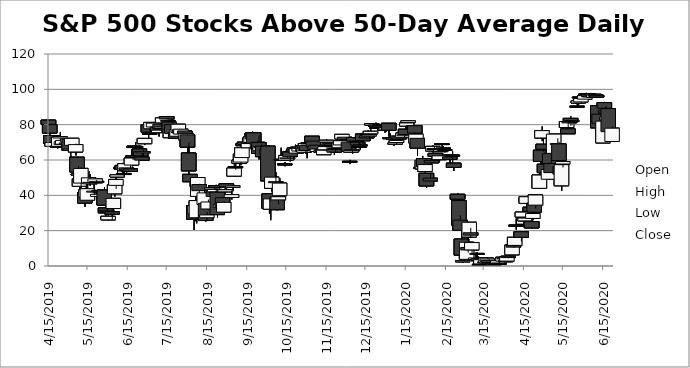
| Category | Open | High | Low | Close |
|---|---|---|---|---|
| 4/15/19 | 82.57 | 82.57 | 79.4 | 80.19 |
| 4/16/19 | 80 | 80 | 74.25 | 75.24 |
| 4/17/19 | 73.86 | 73.86 | 68.51 | 69.3 |
| 4/18/19 | 67.72 | 71.28 | 67.72 | 69.9 |
| 4/22/19 | 67.92 | 69.3 | 66.53 | 67.32 |
| 4/23/19 | 67.72 | 74.05 | 67.72 | 73.06 |
| 4/24/19 | 72.47 | 75.64 | 70.69 | 73.26 |
| 4/25/19 | 68.71 | 71.68 | 67.32 | 70.29 |
| 4/26/19 | 68.91 | 71.08 | 67.72 | 71.08 |
| 4/29/19 | 69.1 | 70.89 | 68.51 | 69.7 |
| 4/30/19 | 70.29 | 72.07 | 66.73 | 72.07 |
| 5/1/19 | 71.88 | 71.88 | 65.54 | 65.54 |
| 5/2/19 | 65.54 | 68.11 | 61.58 | 66.13 |
| 5/3/19 | 68.31 | 72.27 | 68.11 | 72.27 |
| 5/6/19 | 64.55 | 69.3 | 62.57 | 68.71 |
| 5/7/19 | 61.58 | 61.78 | 50.09 | 53.26 |
| 5/8/19 | 51.48 | 56.63 | 51.48 | 52.07 |
| 5/9/19 | 45.14 | 51.08 | 40.39 | 49.3 |
| 5/10/19 | 46.93 | 56.03 | 38.81 | 55.24 |
| 5/13/19 | 41.58 | 41.58 | 33.46 | 35.64 |
| 5/14/19 | 39 | 46.73 | 39 | 43.16 |
| 5/15/19 | 37.22 | 46.53 | 37.22 | 43.76 |
| 5/16/19 | 46.73 | 53.66 | 46.73 | 49.9 |
| 5/17/19 | 46.53 | 51.88 | 45.34 | 47.32 |
| 5/20/19 | 42.37 | 46.13 | 39.4 | 42.17 |
| 5/21/19 | 47.12 | 50.29 | 46.53 | 49.3 |
| 5/22/19 | 47.92 | 48.71 | 46.53 | 47.92 |
| 5/23/19 | 39.4 | 41.18 | 37.42 | 40.59 |
| 5/24/19 | 42.77 | 43.36 | 40.79 | 41.98 |
| 5/28/19 | 42.97 | 44.55 | 34.45 | 34.45 |
| 5/29/19 | 32.87 | 32.87 | 27.32 | 30.09 |
| 5/30/19 | 31.08 | 34.05 | 29.5 | 31.48 |
| 5/31/19 | 26.13 | 29.5 | 25.74 | 28.11 |
| 6/3/19 | 30.69 | 31.48 | 26.13 | 29.36 |
| 6/4/19 | 32.53 | 38.29 | 30.15 | 38.29 |
| 6/5/19 | 40.87 | 46.23 | 39.28 | 46.03 |
| 6/6/19 | 45.63 | 51.38 | 43.65 | 49 |
| 6/7/19 | 50.39 | 54.96 | 50 | 51.58 |
| 6/10/19 | 55.95 | 56.34 | 53.37 | 54.96 |
| 6/11/19 | 56.94 | 58.33 | 51.78 | 54.76 |
| 6/12/19 | 52.38 | 54.16 | 50.59 | 51.78 |
| 6/13/19 | 53.96 | 58.73 | 53.96 | 57.93 |
| 6/14/19 | 55.55 | 55.55 | 52.77 | 54.36 |
| 6/17/19 | 54.96 | 57.34 | 53.37 | 53.57 |
| 6/18/19 | 57.14 | 65.07 | 57.14 | 61.11 |
| 6/19/19 | 62.3 | 63.29 | 59.92 | 61.5 |
| 6/20/19 | 67.06 | 68.05 | 62.69 | 67.85 |
| 6/21/19 | 67.65 | 70.03 | 66.07 | 67.06 |
| 6/24/19 | 66.26 | 67.26 | 62.89 | 62.89 |
| 6/25/19 | 64.68 | 64.68 | 60.91 | 62.3 |
| 6/26/19 | 61.7 | 64.48 | 59.92 | 59.92 |
| 6/27/19 | 64.08 | 65.87 | 62.5 | 64.68 |
| 6/28/19 | 69.24 | 72.42 | 68.45 | 72.22 |
| 7/1/19 | 79.96 | 79.96 | 71.82 | 75.79 |
| 7/2/19 | 75 | 78.17 | 74.4 | 75.09 |
| 7/3/19 | 77.68 | 81.27 | 77.68 | 81.27 |
| 7/5/19 | 78.68 | 80.87 | 76.09 | 80.87 |
| 7/8/19 | 78.68 | 80.27 | 76.09 | 76.69 |
| 7/9/19 | 75.49 | 77.49 | 73.3 | 76.89 |
| 7/10/19 | 80.27 | 81.07 | 77.09 | 77.64 |
| 7/11/19 | 77.84 | 80.23 | 75.44 | 78.64 |
| 7/12/19 | 81.03 | 84.63 | 81.03 | 83.83 |
| 7/15/19 | 84.63 | 84.83 | 83.03 | 83.23 |
| 7/16/19 | 82.43 | 83.83 | 81.43 | 82.03 |
| 7/17/19 | 81.43 | 81.43 | 75.84 | 75.84 |
| 7/18/19 | 72.65 | 79.04 | 72.65 | 77.64 |
| 7/19/19 | 80.03 | 80.63 | 75.04 | 75.04 |
| 7/22/19 | 75.44 | 76.04 | 71.85 | 72.25 |
| 7/23/19 | 73.45 | 77.84 | 72.85 | 77.24 |
| 7/24/19 | 75.64 | 80.43 | 75.64 | 80.23 |
| 7/25/19 | 77.24 | 77.64 | 73.85 | 75.24 |
| 7/26/19 | 74.65 | 77.64 | 74.65 | 77.44 |
| 7/29/19 | 76.44 | 76.44 | 74.25 | 75.04 |
| 7/30/19 | 71.28 | 75.04 | 71.28 | 75.04 |
| 7/31/19 | 74.25 | 74.45 | 64.55 | 67.32 |
| 8/1/19 | 63.96 | 69.9 | 51.68 | 53.86 |
| 8/2/19 | 51.88 | 51.88 | 44.95 | 47.72 |
| 8/5/19 | 34.25 | 34.25 | 20.39 | 26.53 |
| 8/6/19 | 29.5 | 34.45 | 25.34 | 34.25 |
| 8/7/19 | 27.32 | 37.02 | 24.15 | 37.02 |
| 8/8/19 | 39.4 | 50.09 | 39.4 | 50.09 |
| 8/9/19 | 46.13 | 46.53 | 40 | 42.65 |
| 8/12/19 | 39.48 | 39.68 | 36.3 | 37.17 |
| 8/13/19 | 34.79 | 44.53 | 34.79 | 41.38 |
| 8/14/19 | 35.44 | 35.44 | 25.14 | 25.74 |
| 8/15/19 | 27.32 | 30.69 | 25.74 | 28.91 |
| 8/16/19 | 32.27 | 37.62 | 31.88 | 36.23 |
| 8/19/19 | 43.16 | 44.75 | 41.78 | 44.15 |
| 8/20/19 | 41.98 | 43.16 | 39.4 | 39.4 |
| 8/21/19 | 41.98 | 44.35 | 41.98 | 43.36 |
| 8/22/19 | 45.54 | 45.94 | 39.8 | 44.55 |
| 8/23/19 | 41.78 | 43.76 | 27.52 | 29.1 |
| 8/26/19 | 33.06 | 35.04 | 30.09 | 35.04 |
| 8/27/19 | 38.61 | 38.61 | 32.47 | 33.66 |
| 8/28/19 | 30.49 | 36.83 | 30.49 | 36.03 |
| 8/29/19 | 41.98 | 44.15 | 40.99 | 43.16 |
| 8/30/19 | 46.53 | 46.53 | 43.36 | 44.75 |
| 9/3/19 | 38.81 | 42.77 | 37.62 | 40.39 |
| 9/4/19 | 44.55 | 45.54 | 42.37 | 45.34 |
| 9/5/19 | 50.89 | 57.82 | 50.89 | 55.44 |
| 9/6/19 | 56.23 | 59.8 | 54.45 | 56.23 |
| 9/9/19 | 58.01 | 60.99 | 56.83 | 60 |
| 9/10/19 | 58.81 | 63.36 | 57.02 | 63.36 |
| 9/11/19 | 61.38 | 66.93 | 61.38 | 66.93 |
| 9/12/19 | 69.3 | 70.69 | 66.73 | 68.11 |
| 9/13/19 | 70.09 | 71.68 | 67.52 | 68.71 |
| 9/16/19 | 66.93 | 70.29 | 66.93 | 69.3 |
| 9/17/19 | 69.7 | 72.87 | 69.7 | 72.47 |
| 9/18/19 | 69.9 | 73.26 | 65.94 | 73.26 |
| 9/19/19 | 75.24 | 76.03 | 71.88 | 72.02 |
| 9/20/19 | 75.39 | 75.59 | 69.24 | 69.44 |
| 9/23/19 | 67.26 | 71.23 | 67.26 | 70.03 |
| 9/24/19 | 69.84 | 74 | 60.31 | 63.69 |
| 9/25/19 | 65.27 | 68.05 | 61.7 | 67.65 |
| 9/26/19 | 67.65 | 68.84 | 63.49 | 66.86 |
| 9/27/19 | 67.85 | 68.05 | 56.94 | 61.9 |
| 9/30/19 | 63.29 | 67.46 | 63.29 | 66.07 |
| 10/1/19 | 67.85 | 68.45 | 48.21 | 48.21 |
| 10/2/19 | 40.87 | 40.87 | 29.56 | 32.53 |
| 10/3/19 | 32.14 | 38.01 | 25.94 | 38.01 |
| 10/4/19 | 43.96 | 50.29 | 42.17 | 50.29 |
| 10/7/19 | 47.72 | 53.06 | 46.13 | 47.32 |
| 10/8/19 | 39 | 39.6 | 31.48 | 31.88 |
| 10/9/19 | 37.42 | 42.17 | 34.85 | 39.2 |
| 10/10/19 | 39.8 | 49.7 | 39.8 | 46.93 |
| 10/11/19 | 60.19 | 66.93 | 60.19 | 60.39 |
| 10/14/19 | 57.82 | 58.81 | 56.43 | 57.22 |
| 10/15/19 | 59.8 | 65.74 | 59.6 | 62.57 |
| 10/16/19 | 61.18 | 63.96 | 60.59 | 60.79 |
| 10/17/19 | 63.96 | 65.54 | 62.77 | 64.35 |
| 10/18/19 | 64.55 | 64.55 | 59.2 | 61.9 |
| 10/21/19 | 65.07 | 67.26 | 65.07 | 66.26 |
| 10/22/19 | 67.06 | 68.65 | 64.08 | 64.28 |
| 10/23/19 | 63.88 | 66.46 | 63.88 | 66.46 |
| 10/24/19 | 67.26 | 67.46 | 64.08 | 66.86 |
| 10/25/19 | 65.07 | 67.46 | 63.88 | 66.53 |
| 10/28/19 | 67.92 | 69.5 | 64.75 | 64.75 |
| 10/29/19 | 64.35 | 69.7 | 64.35 | 66.73 |
| 10/30/19 | 65.34 | 69.3 | 63.56 | 69.3 |
| 10/31/19 | 68.31 | 68.31 | 60.99 | 65.34 |
| 11/1/19 | 69.7 | 71.68 | 68.11 | 69.5 |
| 11/4/19 | 73.46 | 73.46 | 68.31 | 69.7 |
| 11/5/19 | 70.69 | 70.69 | 66.13 | 67.59 |
| 11/6/19 | 65.8 | 67.79 | 65.6 | 67.79 |
| 11/7/19 | 68.38 | 68.78 | 65.6 | 65.6 |
| 11/8/19 | 64.81 | 66.2 | 64.21 | 66.2 |
| 11/11/19 | 64.41 | 66.6 | 64.41 | 65.4 |
| 11/12/19 | 66.2 | 68.38 | 64.21 | 64.81 |
| 11/13/19 | 63.02 | 66.99 | 63.02 | 65.6 |
| 11/14/19 | 65.8 | 67.59 | 65.4 | 67.59 |
| 11/15/19 | 70.17 | 71.57 | 68.38 | 71.17 |
| 11/18/19 | 69.18 | 70.17 | 68.38 | 69.78 |
| 11/19/19 | 69.18 | 69.18 | 67.19 | 68.19 |
| 11/20/19 | 67.99 | 68.78 | 64.41 | 67.99 |
| 11/21/19 | 66.6 | 66.6 | 62.82 | 64.41 |
| 11/22/19 | 66.6 | 67.39 | 64.21 | 66.13 |
| 11/25/19 | 66.93 | 70.51 | 66.93 | 69.72 |
| 11/26/19 | 68.52 | 71.91 | 68.52 | 70.91 |
| 11/27/19 | 71.91 | 74.7 | 70.91 | 74.5 |
| 11/29/19 | 72.9 | 72.9 | 71.31 | 71.51 |
| 12/2/19 | 70.11 | 70.11 | 64.94 | 65.01 |
| 12/3/19 | 59.28 | 60.07 | 57.7 | 59.28 |
| 12/4/19 | 64.42 | 67.58 | 64.42 | 65.41 |
| 12/5/19 | 65.41 | 66.6 | 63.63 | 65.81 |
| 12/6/19 | 72.72 | 72.72 | 70.69 | 70.69 |
| 12/9/19 | 70.09 | 71.08 | 68.45 | 68.45 |
| 12/10/19 | 67.65 | 70.03 | 66.66 | 67.59 |
| 12/11/19 | 68.38 | 69.38 | 66 | 68.52 |
| 12/12/19 | 71.11 | 73.5 | 70.51 | 72.31 |
| 12/13/19 | 74.7 | 74.7 | 68.72 | 70.91 |
| 12/16/19 | 73.7 | 75.29 | 72.47 | 72.47 |
| 12/17/19 | 74.85 | 76.83 | 73.86 | 74.45 |
| 12/18/19 | 73.66 | 75.24 | 72.47 | 74.45 |
| 12/19/19 | 74.85 | 77.42 | 74.45 | 76.23 |
| 12/20/19 | 79.8 | 80.59 | 79 | 80.59 |
| 12/23/19 | 79.8 | 81.18 | 78.41 | 79 |
| 12/24/19 | 78.01 | 79.2 | 77.82 | 78.41 |
| 12/26/19 | 80 | 80 | 76.63 | 79.6 |
| 12/27/19 | 79 | 80.39 | 78.41 | 79.2 |
| 12/30/19 | 77.22 | 78.81 | 75.44 | 77.42 |
| 12/31/19 | 77.02 | 78.21 | 76.03 | 78.21 |
| 1/2/20 | 80.79 | 80.79 | 73.26 | 76.83 |
| 1/3/20 | 72.07 | 75.04 | 70.89 | 72.67 |
| 1/6/20 | 72.67 | 73.06 | 67.92 | 71.68 |
| 1/7/20 | 68.91 | 71.48 | 68.51 | 69.7 |
| 1/8/20 | 69.9 | 74.05 | 68.91 | 71.08 |
| 1/9/20 | 72.47 | 74.45 | 72.47 | 73.46 |
| 1/10/20 | 73.06 | 75.24 | 71.88 | 71.88 |
| 1/13/20 | 72.67 | 75.44 | 72.47 | 75.24 |
| 1/14/20 | 73.86 | 77.02 | 72.87 | 74.25 |
| 1/15/20 | 77.42 | 78.41 | 73.46 | 74.45 |
| 1/16/20 | 79.2 | 80.99 | 78.41 | 80.99 |
| 1/17/20 | 81.18 | 82.57 | 80.99 | 82.17 |
| 1/21/20 | 79.4 | 80.99 | 77.82 | 78.21 |
| 1/22/20 | 79.4 | 79.4 | 74.45 | 75.24 |
| 1/23/20 | 69.7 | 75.44 | 68.11 | 74.65 |
| 1/24/20 | 72.27 | 72.27 | 62.57 | 66.73 |
| 1/27/20 | 55.84 | 57.22 | 54.25 | 55.15 |
| 1/28/20 | 54.96 | 62.3 | 54.96 | 59.8 |
| 1/29/20 | 60.79 | 60.79 | 56.03 | 56.03 |
| 1/30/20 | 53.46 | 57.62 | 48.91 | 57.42 |
| 1/31/20 | 52.47 | 52.47 | 44.15 | 45.34 |
| 2/3/20 | 49.7 | 52.47 | 48.11 | 48.11 |
| 2/4/20 | 59.8 | 60.59 | 58.01 | 58.41 |
| 2/5/20 | 65.14 | 68.31 | 64.15 | 67.72 |
| 2/6/20 | 66.53 | 67.72 | 65.34 | 65.94 |
| 2/7/20 | 63.76 | 63.96 | 60.39 | 61.98 |
| 2/10/20 | 60.19 | 62.37 | 59.2 | 62.37 |
| 2/11/20 | 64.75 | 67.32 | 64.75 | 65.74 |
| 2/12/20 | 69.1 | 69.3 | 67.12 | 69.3 |
| 2/13/20 | 66.73 | 67.92 | 64.75 | 66.93 |
| 2/14/20 | 65.94 | 66.33 | 64.35 | 65.74 |
| 2/18/20 | 61.78 | 62.37 | 58.21 | 60.39 |
| 2/19/20 | 62.37 | 63.36 | 61.18 | 62.97 |
| 2/20/20 | 62.77 | 64.95 | 57.82 | 62.77 |
| 2/21/20 | 58.21 | 58.21 | 53.86 | 55.84 |
| 2/24/20 | 40.59 | 41.18 | 36.03 | 37.82 |
| 2/25/20 | 37.02 | 37.02 | 22.77 | 23.16 |
| 2/26/20 | 25.94 | 28.71 | 20.19 | 20.19 |
| 2/27/20 | 15.24 | 18.01 | 6.13 | 6.13 |
| 2/28/20 | 2.37 | 3.16 | 1.78 | 2.97 |
| 3/2/20 | 3.76 | 13.46 | 3.76 | 13.46 |
| 3/3/20 | 10.49 | 19.6 | 7.52 | 9.1 |
| 3/4/20 | 16.43 | 24.75 | 16.03 | 24.75 |
| 3/5/20 | 18.81 | 21.58 | 15.84 | 17.42 |
| 3/6/20 | 9.1 | 13.26 | 6.93 | 13.26 |
| 3/9/20 | 3.76 | 7.52 | 3.36 | 4.55 |
| 3/10/20 | 6.93 | 7.92 | 2.97 | 7.12 |
| 3/11/20 | 4.15 | 5.34 | 1.98 | 2.97 |
| 3/12/20 | 0.99 | 1.98 | 0.59 | 0.79 |
| 3/13/20 | 1.18 | 3.56 | 0.79 | 3.56 |
| 3/16/20 | 2.37 | 2.77 | 0.99 | 1.78 |
| 3/17/20 | 1.78 | 4.75 | 1.78 | 4.55 |
| 3/18/20 | 2.57 | 4.55 | 2.57 | 3.96 |
| 3/19/20 | 3.16 | 3.76 | 1.98 | 1.98 |
| 3/20/20 | 1.78 | 1.98 | 0.99 | 1.18 |
| 3/23/20 | 0.79 | 1.38 | 0.79 | 1.18 |
| 3/24/20 | 1.38 | 1.58 | 0.59 | 1.58 |
| 3/25/20 | 1.58 | 1.78 | 0.99 | 1.18 |
| 3/26/20 | 1.58 | 2.97 | 1.58 | 2.97 |
| 3/27/20 | 1.58 | 3.16 | 1.58 | 1.58 |
| 3/30/20 | 2.77 | 4.95 | 2.77 | 4.95 |
| 3/31/20 | 4.55 | 5.54 | 3.76 | 4.15 |
| 4/1/20 | 2.97 | 3.56 | 2.17 | 2.77 |
| 4/2/20 | 2.77 | 5.14 | 2.77 | 5.14 |
| 4/3/20 | 5.54 | 5.54 | 4.35 | 4.76 |
| 4/6/20 | 6.34 | 11.85 | 6.34 | 11.85 |
| 4/7/20 | 11.85 | 16 | 10.27 | 10.67 |
| 4/8/20 | 11.66 | 18.41 | 10.67 | 16.23 |
| 4/9/20 | 23.16 | 26.93 | 20.59 | 22.57 |
| 4/13/20 | 19.4 | 19.4 | 13.86 | 16.23 |
| 4/14/20 | 27.72 | 30.89 | 25.54 | 30.49 |
| 4/15/20 | 23.56 | 24.95 | 21.98 | 23.56 |
| 4/16/20 | 25.54 | 27.12 | 22.57 | 27.12 |
| 4/17/20 | 35.44 | 39.2 | 31.68 | 39.2 |
| 4/20/20 | 33.26 | 37.62 | 31.08 | 31.08 |
| 4/21/20 | 25.14 | 26.73 | 21.18 | 21.58 |
| 4/22/20 | 26.93 | 31.88 | 25.94 | 29.7 |
| 4/23/20 | 35.64 | 37.02 | 30.29 | 30.49 |
| 4/24/20 | 34.45 | 40.39 | 32.47 | 40.19 |
| 4/27/20 | 43.96 | 53.26 | 43.56 | 51.48 |
| 4/28/20 | 65.54 | 66.53 | 56.83 | 59.2 |
| 4/29/20 | 72.47 | 79 | 70.69 | 76.63 |
| 4/30/20 | 68.91 | 71.68 | 64.75 | 66.13 |
| 5/1/20 | 57.62 | 57.62 | 51.28 | 52.87 |
| 5/4/20 | 49.1 | 54.65 | 49.1 | 54.65 |
| 5/5/20 | 63.56 | 64.95 | 58.01 | 58.01 |
| 5/6/20 | 58.01 | 60.19 | 52.87 | 52.87 |
| 5/7/20 | 65.54 | 68.71 | 63.16 | 63.76 |
| 5/8/20 | 63.76 | 74.65 | 63.76 | 74.65 |
| 5/11/20 | 69.3 | 72.27 | 66.93 | 69.1 |
| 5/12/20 | 69.1 | 70.29 | 59.72 | 59.72 |
| 5/13/20 | 56.15 | 58.33 | 49.4 | 51.98 |
| 5/14/20 | 45.43 | 57.53 | 42.46 | 57.34 |
| 5/15/20 | 57.73 | 60.31 | 55.75 | 59.12 |
| 5/18/20 | 78.37 | 83.76 | 76.58 | 81.78 |
| 5/19/20 | 77.62 | 82.37 | 74.85 | 74.85 |
| 5/20/20 | 81.58 | 83.76 | 80.59 | 81.58 |
| 5/21/20 | 83.56 | 84.75 | 79.4 | 81.58 |
| 5/22/20 | 81.78 | 82.37 | 79.6 | 82.37 |
| 5/26/20 | 90.49 | 92.07 | 89.9 | 90.49 |
| 5/27/20 | 92.27 | 93.46 | 90.09 | 93.46 |
| 5/28/20 | 95.64 | 96.43 | 95.44 | 95.64 |
| 5/29/20 | 92.87 | 95.04 | 92.27 | 94.85 |
| 6/1/20 | 94.45 | 96.83 | 94.45 | 96.43 |
| 6/2/20 | 96.83 | 98.01 | 96.83 | 97.42 |
| 6/3/20 | 97.62 | 97.82 | 96.63 | 97.22 |
| 6/4/20 | 97.22 | 97.42 | 95.04 | 95.84 |
| 6/5/20 | 96.03 | 97.22 | 95.84 | 96.23 |
| 6/8/20 | 95.44 | 97.42 | 95.24 | 97.22 |
| 6/9/20 | 96.83 | 97.42 | 96.23 | 96.63 |
| 6/10/20 | 96.63 | 96.63 | 95.64 | 95.64 |
| 6/11/20 | 90.69 | 92.27 | 77.82 | 78.21 |
| 6/12/20 | 85.94 | 86.93 | 71.88 | 80.79 |
| 6/15/20 | 69.7 | 83.56 | 69.7 | 81.98 |
| 6/16/20 | 92.47 | 92.87 | 85.94 | 89.3 |
| 6/17/20 | 87.92 | 90.49 | 85.74 | 86.53 |
| 6/18/20 | 82.57 | 85.74 | 81.38 | 84.55 |
| 6/19/20 | 89.1 | 89.3 | 75.04 | 76.03 |
| 6/22/20 | 70.49 | 79 | 70.49 | 78.01 |